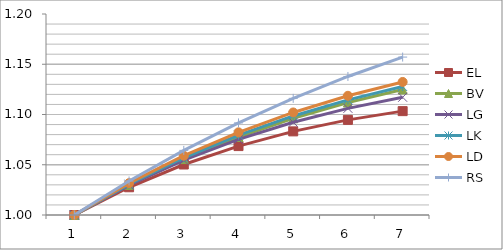
| Category | EL | BV | LG | LK | LD | RS |
|---|---|---|---|---|---|---|
| 0 | 1 | 1 | 1 | 1 | 1 | 1 |
| 1 | 1.028 | 1.03 | 1.03 | 1.031 | 1.032 | 1.034 |
| 2 | 1.05 | 1.056 | 1.055 | 1.057 | 1.059 | 1.064 |
| 3 | 1.069 | 1.078 | 1.075 | 1.079 | 1.082 | 1.092 |
| 4 | 1.083 | 1.096 | 1.092 | 1.099 | 1.102 | 1.116 |
| 5 | 1.095 | 1.112 | 1.106 | 1.115 | 1.119 | 1.138 |
| 6 | 1.103 | 1.125 | 1.117 | 1.128 | 1.132 | 1.157 |